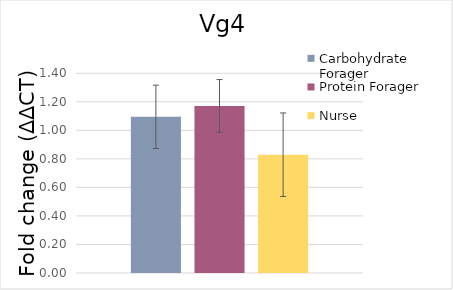
| Category | Carbohydrate Forager | Protein Forager | Nurse |
|---|---|---|---|
| Vg4 | 1.095 | 1.171 | 0.829 |